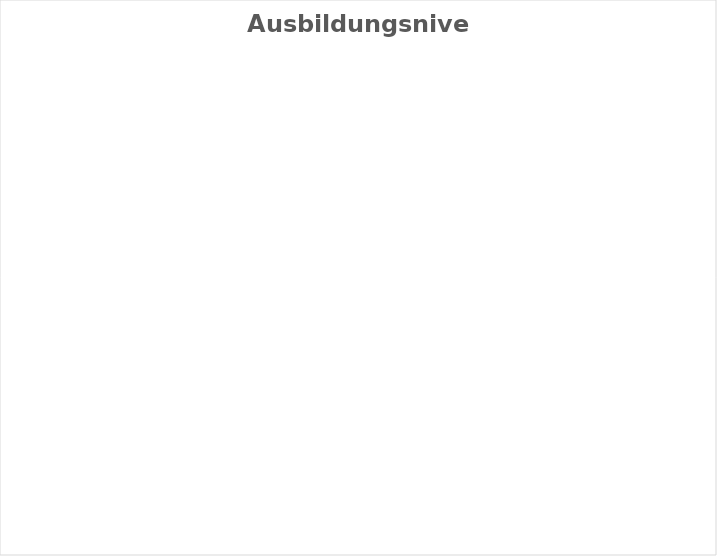
| Category | EFZ | Series 1 |
|---|---|---|
| EFZ | 0 | 0 |
| EBA | 0 | 0 |
| PrA INSOS | IV-Anlehre | 0 | 0 |
| Suported Education | 0 | 0 |
| Andere | 0 | 0 |